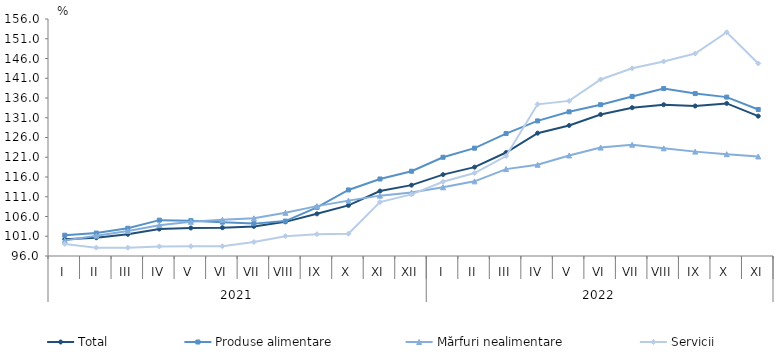
| Category | Total  | Produse alimentare | Mărfuri nealimentare  | Servicii |
|---|---|---|---|---|
| 0 | 100.216 | 101.263 | 99.917 | 99.046 |
| 1 | 100.619 | 101.8 | 101.154 | 98.109 |
| 2 | 101.493 | 103.024 | 102.337 | 98.107 |
| 3 | 102.826 | 105.075 | 103.801 | 98.417 |
| 4 | 103.092 | 104.95 | 104.66 | 98.463 |
| 5 | 103.16 | 104.567 | 105.161 | 98.472 |
| 6 | 103.487 | 104.197 | 105.536 | 99.549 |
| 7 | 104.645 | 104.834 | 106.928 | 101.023 |
| 8 | 106.675 | 108.308 | 108.624 | 101.521 |
| 9 | 108.814 | 112.725 | 110.021 | 101.642 |
| 10 | 112.438 | 115.494 | 111.282 | 109.649 |
| 11 | 113.937 | 117.461 | 112.055 | 111.591 |
| 12 | 116.6 | 121 | 113.4 | 114.8 |
| 13 | 118.5 | 123.3 | 114.9 | 117 |
| 14 | 122.2 | 127 | 118 | 121.3 |
| 15 | 127.1 | 130.2 | 119.1 | 134.4 |
| 16 | 129.047 | 132.5 | 121.45 | 135.267 |
| 17 | 131.827 | 134.301 | 123.443 | 140.701 |
| 18 | 133.547 | 136.399 | 124.168 | 143.511 |
| 19 | 134.294 | 138.387 | 123.257 | 145.253 |
| 20 | 133.971 | 137.121 | 122.424 | 147.248 |
| 21 | 134.625 | 136.226 | 121.779 | 152.646 |
| 22 | 131.406 | 133.093 | 121.201 | 144.742 |